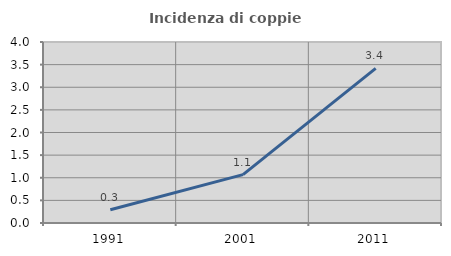
| Category | Incidenza di coppie miste |
|---|---|
| 1991.0 | 0.293 |
| 2001.0 | 1.068 |
| 2011.0 | 3.417 |